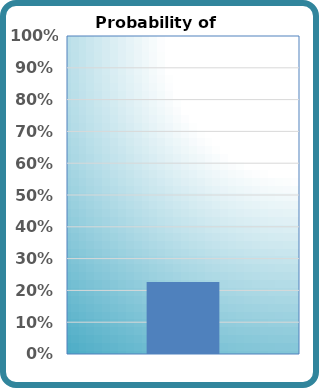
| Category | Probability of Success |
|---|---|
| 0 | 0.226 |